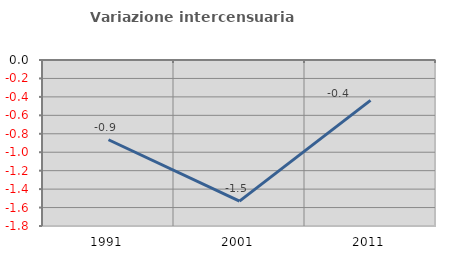
| Category | Variazione intercensuaria annua |
|---|---|
| 1991.0 | -0.865 |
| 2001.0 | -1.531 |
| 2011.0 | -0.438 |